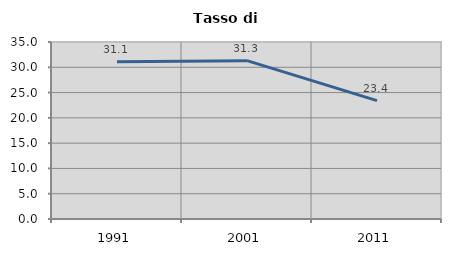
| Category | Tasso di disoccupazione   |
|---|---|
| 1991.0 | 31.109 |
| 2001.0 | 31.316 |
| 2011.0 | 23.416 |